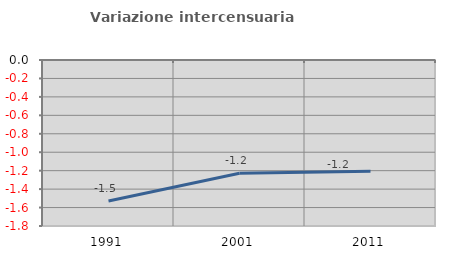
| Category | Variazione intercensuaria annua |
|---|---|
| 1991.0 | -1.53 |
| 2001.0 | -1.227 |
| 2011.0 | -1.206 |